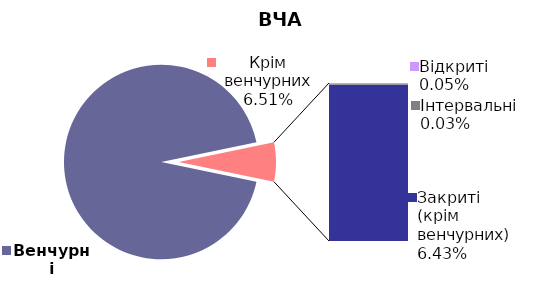
| Category | 30.06.2021 |
|---|---|
| Венчурні | 0.935 |
| Відкриті | 0 |
| Інтервальні | 0 |
| Закриті (крім венчурних) | 0.064 |